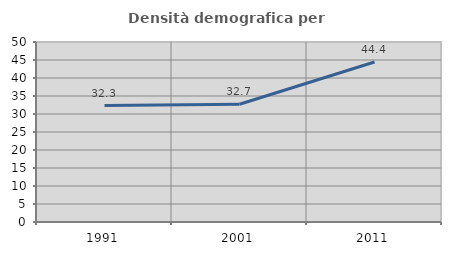
| Category | Densità demografica |
|---|---|
| 1991.0 | 32.346 |
| 2001.0 | 32.695 |
| 2011.0 | 44.445 |